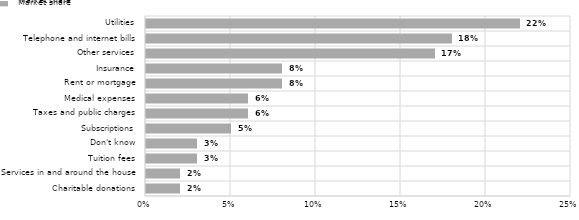
| Category | Market share |
|---|---|
| Charitable donations | 0.02 |
| Services in and around the house | 0.02 |
| Tuition fees | 0.03 |
| Don't know | 0.03 |
| Subscriptions | 0.05 |
| Taxes and public charges | 0.06 |
| Medical expenses | 0.06 |
| Rent or mortgage | 0.08 |
| Insurance | 0.08 |
| Other services | 0.17 |
| Telephone and internet bills | 0.18 |
| Utilities | 0.22 |